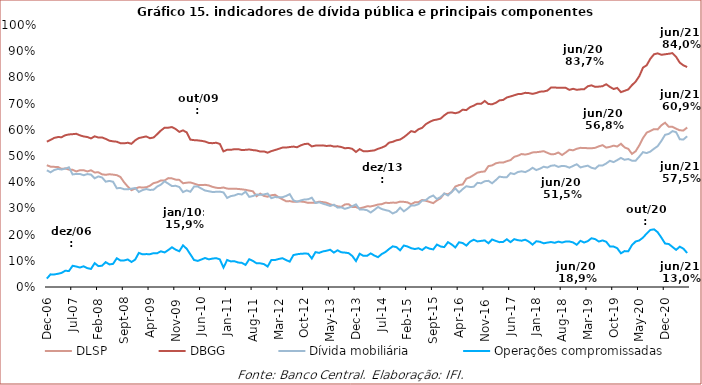
| Category | DLSP | DBGG | Dívida mobiliária | Operações compromissadas |
|---|---|---|---|---|
| 2006-12-01 | 0.465 | 0.555 | 0.446 | 0.032 |
| 2007-01-01 | 0.459 | 0.562 | 0.438 | 0.048 |
| 2007-02-01 | 0.459 | 0.569 | 0.446 | 0.048 |
| 2007-03-01 | 0.458 | 0.572 | 0.451 | 0.05 |
| 2007-04-01 | 0.451 | 0.572 | 0.448 | 0.054 |
| 2007-05-01 | 0.452 | 0.579 | 0.452 | 0.062 |
| 2007-06-01 | 0.448 | 0.582 | 0.457 | 0.061 |
| 2007-07-01 | 0.447 | 0.583 | 0.43 | 0.081 |
| 2007-08-01 | 0.441 | 0.585 | 0.432 | 0.078 |
| 2007-09-01 | 0.446 | 0.579 | 0.431 | 0.074 |
| 2007-10-01 | 0.446 | 0.575 | 0.427 | 0.079 |
| 2007-11-01 | 0.441 | 0.572 | 0.431 | 0.072 |
| 2007-12-01 | 0.445 | 0.567 | 0.429 | 0.069 |
| 2008-01-01 | 0.437 | 0.575 | 0.415 | 0.091 |
| 2008-02-01 | 0.438 | 0.57 | 0.422 | 0.08 |
| 2008-03-01 | 0.43 | 0.571 | 0.418 | 0.081 |
| 2008-04-01 | 0.428 | 0.565 | 0.402 | 0.095 |
| 2008-05-01 | 0.43 | 0.558 | 0.405 | 0.086 |
| 2008-06-01 | 0.429 | 0.556 | 0.402 | 0.088 |
| 2008-07-01 | 0.427 | 0.555 | 0.377 | 0.11 |
| 2008-08-01 | 0.42 | 0.549 | 0.378 | 0.101 |
| 2008-09-01 | 0.4 | 0.548 | 0.373 | 0.101 |
| 2008-10-01 | 0.383 | 0.551 | 0.373 | 0.105 |
| 2008-11-01 | 0.37 | 0.547 | 0.375 | 0.095 |
| 2008-12-01 | 0.376 | 0.56 | 0.378 | 0.105 |
| 2009-01-01 | 0.38 | 0.569 | 0.363 | 0.13 |
| 2009-02-01 | 0.38 | 0.572 | 0.37 | 0.125 |
| 2009-03-01 | 0.38 | 0.575 | 0.374 | 0.126 |
| 2009-04-01 | 0.386 | 0.568 | 0.37 | 0.125 |
| 2009-05-01 | 0.397 | 0.571 | 0.371 | 0.129 |
| 2009-06-01 | 0.4 | 0.583 | 0.383 | 0.129 |
| 2009-07-01 | 0.407 | 0.597 | 0.391 | 0.136 |
| 2009-08-01 | 0.407 | 0.608 | 0.403 | 0.132 |
| 2009-09-01 | 0.416 | 0.608 | 0.394 | 0.141 |
| 2009-10-01 | 0.415 | 0.611 | 0.385 | 0.152 |
| 2009-11-01 | 0.41 | 0.603 | 0.386 | 0.143 |
| 2009-12-01 | 0.409 | 0.592 | 0.382 | 0.136 |
| 2010-01-01 | 0.396 | 0.598 | 0.362 | 0.159 |
| 2010-02-01 | 0.398 | 0.59 | 0.369 | 0.146 |
| 2010-03-01 | 0.399 | 0.562 | 0.364 | 0.125 |
| 2010-04-01 | 0.395 | 0.561 | 0.383 | 0.103 |
| 2010-05-01 | 0.39 | 0.56 | 0.384 | 0.1 |
| 2010-06-01 | 0.389 | 0.558 | 0.376 | 0.105 |
| 2010-07-01 | 0.39 | 0.555 | 0.368 | 0.111 |
| 2010-08-01 | 0.388 | 0.55 | 0.366 | 0.106 |
| 2010-09-01 | 0.382 | 0.549 | 0.363 | 0.108 |
| 2010-10-01 | 0.379 | 0.551 | 0.363 | 0.11 |
| 2010-11-01 | 0.377 | 0.546 | 0.364 | 0.106 |
| 2010-12-01 | 0.38 | 0.518 | 0.361 | 0.074 |
| 2011-01-01 | 0.376 | 0.524 | 0.34 | 0.103 |
| 2011-02-01 | 0.375 | 0.524 | 0.347 | 0.098 |
| 2011-03-01 | 0.375 | 0.526 | 0.35 | 0.098 |
| 2011-04-01 | 0.374 | 0.526 | 0.355 | 0.093 |
| 2011-05-01 | 0.373 | 0.523 | 0.353 | 0.092 |
| 2011-06-01 | 0.371 | 0.524 | 0.364 | 0.084 |
| 2011-07-01 | 0.368 | 0.525 | 0.344 | 0.106 |
| 2011-08-01 | 0.365 | 0.523 | 0.347 | 0.1 |
| 2011-09-01 | 0.347 | 0.521 | 0.353 | 0.09 |
| 2011-10-01 | 0.356 | 0.517 | 0.352 | 0.09 |
| 2011-11-01 | 0.348 | 0.517 | 0.353 | 0.087 |
| 2011-12-01 | 0.345 | 0.513 | 0.357 | 0.078 |
| 2012-01-01 | 0.35 | 0.519 | 0.339 | 0.103 |
| 2012-02-01 | 0.352 | 0.523 | 0.343 | 0.103 |
| 2012-03-01 | 0.343 | 0.527 | 0.342 | 0.107 |
| 2012-04-01 | 0.335 | 0.532 | 0.342 | 0.11 |
| 2012-05-01 | 0.327 | 0.532 | 0.347 | 0.103 |
| 2012-06-01 | 0.328 | 0.534 | 0.355 | 0.097 |
| 2012-07-01 | 0.325 | 0.536 | 0.331 | 0.122 |
| 2012-08-01 | 0.326 | 0.533 | 0.325 | 0.125 |
| 2012-09-01 | 0.326 | 0.54 | 0.33 | 0.127 |
| 2012-10-01 | 0.325 | 0.546 | 0.334 | 0.128 |
| 2012-11-01 | 0.321 | 0.547 | 0.335 | 0.127 |
| 2012-12-01 | 0.322 | 0.537 | 0.341 | 0.109 |
| 2013-01-01 | 0.322 | 0.54 | 0.321 | 0.133 |
| 2013-02-01 | 0.326 | 0.54 | 0.323 | 0.13 |
| 2013-03-01 | 0.324 | 0.541 | 0.318 | 0.136 |
| 2013-04-01 | 0.322 | 0.538 | 0.314 | 0.138 |
| 2013-05-01 | 0.315 | 0.54 | 0.309 | 0.142 |
| 2013-06-01 | 0.312 | 0.536 | 0.314 | 0.131 |
| 2013-07-01 | 0.308 | 0.537 | 0.303 | 0.14 |
| 2013-08-01 | 0.306 | 0.534 | 0.304 | 0.133 |
| 2013-09-01 | 0.315 | 0.529 | 0.298 | 0.131 |
| 2013-10-01 | 0.316 | 0.531 | 0.303 | 0.129 |
| 2013-11-01 | 0.306 | 0.527 | 0.308 | 0.118 |
| 2013-12-01 | 0.305 | 0.515 | 0.315 | 0.099 |
| 2014-01-01 | 0.3 | 0.526 | 0.296 | 0.127 |
| 2014-02-01 | 0.304 | 0.518 | 0.296 | 0.119 |
| 2014-03-01 | 0.308 | 0.518 | 0.293 | 0.119 |
| 2014-04-01 | 0.308 | 0.52 | 0.284 | 0.128 |
| 2014-05-01 | 0.311 | 0.521 | 0.294 | 0.12 |
| 2014-06-01 | 0.315 | 0.527 | 0.305 | 0.114 |
| 2014-07-01 | 0.316 | 0.532 | 0.298 | 0.126 |
| 2014-08-01 | 0.321 | 0.538 | 0.294 | 0.133 |
| 2014-09-01 | 0.321 | 0.551 | 0.29 | 0.145 |
| 2014-10-01 | 0.322 | 0.554 | 0.281 | 0.155 |
| 2014-11-01 | 0.322 | 0.56 | 0.287 | 0.152 |
| 2014-12-01 | 0.326 | 0.563 | 0.303 | 0.14 |
| 2015-01-01 | 0.325 | 0.572 | 0.289 | 0.158 |
| 2015-02-01 | 0.323 | 0.583 | 0.299 | 0.155 |
| 2015-03-01 | 0.316 | 0.595 | 0.311 | 0.148 |
| 2015-04-01 | 0.323 | 0.591 | 0.311 | 0.145 |
| 2015-05-01 | 0.324 | 0.602 | 0.316 | 0.148 |
| 2015-06-01 | 0.332 | 0.607 | 0.33 | 0.141 |
| 2015-07-01 | 0.329 | 0.622 | 0.332 | 0.152 |
| 2015-08-01 | 0.325 | 0.63 | 0.343 | 0.146 |
| 2015-09-01 | 0.32 | 0.636 | 0.349 | 0.144 |
| 2015-10-01 | 0.33 | 0.639 | 0.336 | 0.162 |
| 2015-11-01 | 0.339 | 0.643 | 0.343 | 0.155 |
| 2015-12-01 | 0.356 | 0.655 | 0.357 | 0.152 |
| 2016-01-01 | 0.353 | 0.665 | 0.349 | 0.171 |
| 2016-02-01 | 0.363 | 0.666 | 0.362 | 0.162 |
| 2016-03-01 | 0.383 | 0.663 | 0.376 | 0.151 |
| 2016-04-01 | 0.389 | 0.667 | 0.361 | 0.171 |
| 2016-05-01 | 0.391 | 0.677 | 0.373 | 0.168 |
| 2016-06-01 | 0.413 | 0.675 | 0.385 | 0.158 |
| 2016-07-01 | 0.419 | 0.686 | 0.382 | 0.173 |
| 2016-08-01 | 0.427 | 0.692 | 0.382 | 0.18 |
| 2016-09-01 | 0.436 | 0.7 | 0.398 | 0.174 |
| 2016-10-01 | 0.44 | 0.699 | 0.396 | 0.176 |
| 2016-11-01 | 0.441 | 0.71 | 0.404 | 0.178 |
| 2016-12-01 | 0.461 | 0.698 | 0.405 | 0.167 |
| 2017-01-01 | 0.464 | 0.697 | 0.396 | 0.181 |
| 2017-02-01 | 0.472 | 0.703 | 0.408 | 0.176 |
| 2017-03-01 | 0.475 | 0.712 | 0.421 | 0.171 |
| 2017-04-01 | 0.475 | 0.714 | 0.419 | 0.172 |
| 2017-05-01 | 0.48 | 0.723 | 0.419 | 0.182 |
| 2017-06-01 | 0.484 | 0.727 | 0.435 | 0.171 |
| 2017-07-01 | 0.497 | 0.732 | 0.431 | 0.183 |
| 2017-08-01 | 0.501 | 0.736 | 0.439 | 0.179 |
| 2017-09-01 | 0.508 | 0.737 | 0.442 | 0.177 |
| 2017-10-01 | 0.505 | 0.741 | 0.439 | 0.181 |
| 2017-11-01 | 0.508 | 0.74 | 0.445 | 0.173 |
| 2017-12-01 | 0.514 | 0.737 | 0.455 | 0.162 |
| 2018-01-01 | 0.514 | 0.741 | 0.446 | 0.175 |
| 2018-02-01 | 0.516 | 0.746 | 0.452 | 0.173 |
| 2018-03-01 | 0.518 | 0.746 | 0.459 | 0.167 |
| 2018-04-01 | 0.512 | 0.75 | 0.456 | 0.169 |
| 2018-05-01 | 0.507 | 0.761 | 0.463 | 0.172 |
| 2018-06-01 | 0.507 | 0.762 | 0.464 | 0.169 |
| 2018-07-01 | 0.513 | 0.76 | 0.458 | 0.173 |
| 2018-08-01 | 0.504 | 0.761 | 0.462 | 0.17 |
| 2018-09-01 | 0.513 | 0.76 | 0.461 | 0.174 |
| 2018-10-01 | 0.524 | 0.753 | 0.455 | 0.174 |
| 2018-11-01 | 0.522 | 0.756 | 0.462 | 0.17 |
| 2018-12-01 | 0.528 | 0.753 | 0.469 | 0.161 |
| 2019-01-01 | 0.531 | 0.754 | 0.456 | 0.176 |
| 2019-02-01 | 0.531 | 0.755 | 0.46 | 0.17 |
| 2019-03-01 | 0.53 | 0.766 | 0.463 | 0.175 |
| 2019-04-01 | 0.53 | 0.77 | 0.455 | 0.186 |
| 2019-05-01 | 0.531 | 0.764 | 0.452 | 0.183 |
| 2019-06-01 | 0.537 | 0.765 | 0.464 | 0.173 |
| 2019-07-01 | 0.541 | 0.766 | 0.464 | 0.178 |
| 2019-08-01 | 0.532 | 0.774 | 0.471 | 0.173 |
| 2019-09-01 | 0.535 | 0.764 | 0.482 | 0.155 |
| 2019-10-01 | 0.54 | 0.756 | 0.477 | 0.155 |
| 2019-11-01 | 0.536 | 0.76 | 0.484 | 0.148 |
| 2019-12-01 | 0.547 | 0.744 | 0.493 | 0.129 |
| 2020-01-01 | 0.533 | 0.749 | 0.486 | 0.137 |
| 2020-02-01 | 0.527 | 0.754 | 0.488 | 0.136 |
| 2020-03-01 | 0.508 | 0.77 | 0.482 | 0.16 |
| 2020-04-01 | 0.518 | 0.784 | 0.482 | 0.174 |
| 2020-05-01 | 0.541 | 0.805 | 0.498 | 0.178 |
| 2020-06-01 | 0.568 | 0.837 | 0.515 | 0.189 |
| 2020-07-01 | 0.589 | 0.846 | 0.511 | 0.204 |
| 2020-08-01 | 0.596 | 0.871 | 0.517 | 0.218 |
| 2020-09-01 | 0.603 | 0.888 | 0.528 | 0.22 |
| 2020-10-01 | 0.602 | 0.892 | 0.538 | 0.209 |
| 2020-11-01 | 0.617 | 0.886 | 0.558 | 0.188 |
| 2020-12-01 | 0.627 | 0.888 | 0.581 | 0.166 |
| 2021-01-01 | 0.612 | 0.89 | 0.584 | 0.164 |
| 2021-02-01 | 0.611 | 0.893 | 0.595 | 0.153 |
| 2021-03-01 | 0.604 | 0.878 | 0.591 | 0.142 |
| 2021-04-01 | 0.598 | 0.856 | 0.564 | 0.154 |
| 2021-05-01 | 0.598 | 0.846 | 0.563 | 0.146 |
| 2021-06-01 | 0.609 | 0.84 | 0.575 | 0.13 |